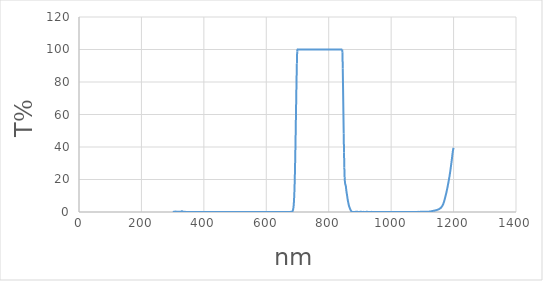
| Category | Series 0 |
|---|---|
| 1200.0 | 39.49 |
| 1199.0 | 38.78 |
| 1198.0 | 37.72 |
| 1197.0 | 36.38 |
| 1196.0 | 34.84 |
| 1195.0 | 33.22 |
| 1194.0 | 31.64 |
| 1193.0 | 30.16 |
| 1192.0 | 28.74 |
| 1191.0 | 27.26 |
| 1190.0 | 25.84 |
| 1189.0 | 24.49 |
| 1188.0 | 23.21 |
| 1187.0 | 22.01 |
| 1186.0 | 20.9 |
| 1185.0 | 19.81 |
| 1184.0 | 18.75 |
| 1183.0 | 17.7 |
| 1182.0 | 16.68 |
| 1181.0 | 15.68 |
| 1180.0 | 14.71 |
| 1179.0 | 13.77 |
| 1178.0 | 12.87 |
| 1177.0 | 12.02 |
| 1176.0 | 11.18 |
| 1175.0 | 10.39 |
| 1174.0 | 9.61 |
| 1173.0 | 8.84 |
| 1172.0 | 8.1 |
| 1171.0 | 7.39 |
| 1170.0 | 6.73 |
| 1169.0 | 6.09 |
| 1168.0 | 5.51 |
| 1167.0 | 4.98 |
| 1166.0 | 4.52 |
| 1165.0 | 4.13 |
| 1164.0 | 3.78 |
| 1163.0 | 3.48 |
| 1162.0 | 3.2 |
| 1161.0 | 2.96 |
| 1160.0 | 2.74 |
| 1159.0 | 2.55 |
| 1158.0 | 2.37 |
| 1157.0 | 2.21 |
| 1156.0 | 2.09 |
| 1155.0 | 1.97 |
| 1154.0 | 1.86 |
| 1153.0 | 1.75 |
| 1152.0 | 1.66 |
| 1151.0 | 1.57 |
| 1150.0 | 1.48 |
| 1149.0 | 1.41 |
| 1148.0 | 1.34 |
| 1147.0 | 1.27 |
| 1146.0 | 1.22 |
| 1145.0 | 1.16 |
| 1144.0 | 1.12 |
| 1143.0 | 1.06 |
| 1142.0 | 1.01 |
| 1141.0 | 0.96 |
| 1140.0 | 0.91 |
| 1139.0 | 0.85 |
| 1138.0 | 0.8 |
| 1137.0 | 0.77 |
| 1136.0 | 0.74 |
| 1135.0 | 0.71 |
| 1134.0 | 0.69 |
| 1133.0 | 0.66 |
| 1132.0 | 0.62 |
| 1131.0 | 0.56 |
| 1130.0 | 0.51 |
| 1129.0 | 0.45 |
| 1128.0 | 0.4 |
| 1127.0 | 0.37 |
| 1126.0 | 0.34 |
| 1125.0 | 0.32 |
| 1124.0 | 0.3 |
| 1123.0 | 0.28 |
| 1122.0 | 0.24 |
| 1121.0 | 0.2 |
| 1120.0 | 0.17 |
| 1119.0 | 0.15 |
| 1118.0 | 0.14 |
| 1117.0 | 0.14 |
| 1116.0 | 0.15 |
| 1115.0 | 0.15 |
| 1114.0 | 0.15 |
| 1113.0 | 0.15 |
| 1112.0 | 0.13 |
| 1111.0 | 0.11 |
| 1110.0 | 0.12 |
| 1109.0 | 0.12 |
| 1108.0 | 0.13 |
| 1107.0 | 0.14 |
| 1106.0 | 0.15 |
| 1105.0 | 0.14 |
| 1104.0 | 0.14 |
| 1103.0 | 0.12 |
| 1102.0 | 0.11 |
| 1101.0 | 0.1 |
| 1100.0 | 0.09 |
| 1099.0 | 0.1 |
| 1098.0 | 0.11 |
| 1097.0 | 0.12 |
| 1096.0 | 0.13 |
| 1095.0 | 0.11 |
| 1094.0 | 0.11 |
| 1093.0 | 0.09 |
| 1092.0 | 0.08 |
| 1091.0 | 0.07 |
| 1090.0 | 0.06 |
| 1089.0 | 0.07 |
| 1088.0 | 0.07 |
| 1087.0 | 0.09 |
| 1086.0 | 0.08 |
| 1085.0 | 0.07 |
| 1084.0 | 0.06 |
| 1083.0 | 0.05 |
| 1082.0 | 0.05 |
| 1081.0 | 0.03 |
| 1080.0 | 0.03 |
| 1079.0 | 0.04 |
| 1078.0 | 0.03 |
| 1077.0 | 0.01 |
| 1076.0 | 0.01 |
| 1075.0 | 0.01 |
| 1074.0 | 0 |
| 1073.0 | 0.01 |
| 1072.0 | 0.01 |
| 1071.0 | 0.01 |
| 1070.0 | 0 |
| 1069.0 | 0 |
| 1068.0 | 0.01 |
| 1067.0 | 0.02 |
| 1066.0 | 0.01 |
| 1065.0 | 0 |
| 1064.0 | 0.02 |
| 1063.0 | 0.02 |
| 1062.0 | 0.01 |
| 1061.0 | 0 |
| 1060.0 | 0.01 |
| 1059.0 | 0 |
| 1058.0 | 0.01 |
| 1057.0 | 0.03 |
| 1056.0 | 0.04 |
| 1055.0 | 0.04 |
| 1054.0 | 0.03 |
| 1053.0 | 0.02 |
| 1052.0 | 0 |
| 1051.0 | 0.01 |
| 1050.0 | 0.02 |
| 1049.0 | 0 |
| 1048.0 | 0.01 |
| 1047.0 | 0.02 |
| 1046.0 | 0.04 |
| 1045.0 | 0.04 |
| 1044.0 | 0.03 |
| 1043.0 | 0.03 |
| 1042.0 | 0.04 |
| 1041.0 | 0.03 |
| 1040.0 | 0.02 |
| 1039.0 | 0.03 |
| 1038.0 | 0.03 |
| 1037.0 | 0.02 |
| 1036.0 | 0.02 |
| 1035.0 | 0.01 |
| 1034.0 | 0.02 |
| 1033.0 | 0.02 |
| 1032.0 | 0.02 |
| 1031.0 | 0.02 |
| 1030.0 | 0.02 |
| 1029.0 | 0.02 |
| 1028.0 | 0.03 |
| 1027.0 | 0.02 |
| 1026.0 | 0.02 |
| 1025.0 | 0.02 |
| 1024.0 | 0.02 |
| 1023.0 | 0.03 |
| 1022.0 | 0.03 |
| 1021.0 | 0.04 |
| 1020.0 | 0.05 |
| 1019.0 | 0.05 |
| 1018.0 | 0.05 |
| 1017.0 | 0.05 |
| 1016.0 | 0.03 |
| 1015.0 | 0.02 |
| 1014.0 | 0.02 |
| 1013.0 | 0.03 |
| 1012.0 | 0.04 |
| 1011.0 | 0.05 |
| 1010.0 | 0.06 |
| 1009.0 | 0.05 |
| 1008.0 | 0.05 |
| 1007.0 | 0.04 |
| 1006.0 | 0.03 |
| 1005.0 | 0.01 |
| 1004.0 | 0 |
| 1003.0 | 0.01 |
| 1002.0 | 0.01 |
| 1001.0 | 0.02 |
| 1000.0 | 0.01 |
| 999.0 | 0.01 |
| 998.0 | 0 |
| 997.0 | 0.01 |
| 996.0 | 0.01 |
| 995.0 | 0.03 |
| 994.0 | 0.03 |
| 993.0 | 0.03 |
| 992.0 | 0.02 |
| 991.0 | 0.01 |
| 990.0 | 0 |
| 989.0 | 0 |
| 988.0 | 0.01 |
| 987.0 | 0 |
| 986.0 | 0.02 |
| 985.0 | 0.03 |
| 984.0 | 0.04 |
| 983.0 | 0.04 |
| 982.0 | 0.02 |
| 981.0 | 0.01 |
| 980.0 | 0.01 |
| 979.0 | 0.01 |
| 978.0 | 0 |
| 977.0 | 0.01 |
| 976.0 | 0.02 |
| 975.0 | 0.04 |
| 974.0 | 0.05 |
| 973.0 | 0.04 |
| 972.0 | 0.04 |
| 971.0 | 0.02 |
| 970.0 | 0.03 |
| 969.0 | 0.04 |
| 968.0 | 0.03 |
| 967.0 | 0.01 |
| 966.0 | 0 |
| 965.0 | 0.01 |
| 964.0 | 0 |
| 963.0 | 0.01 |
| 962.0 | 0.01 |
| 961.0 | 0 |
| 960.0 | 0.03 |
| 959.0 | 0.05 |
| 958.0 | 0.04 |
| 957.0 | 0.01 |
| 956.0 | 0 |
| 955.0 | 0.01 |
| 954.0 | 0.03 |
| 953.0 | 0.01 |
| 952.0 | 0.01 |
| 951.0 | 0.03 |
| 950.0 | 0.04 |
| 949.0 | 0.04 |
| 948.0 | 0.04 |
| 947.0 | 0.03 |
| 946.0 | 0.01 |
| 945.0 | 0.02 |
| 944.0 | 0 |
| 943.0 | 0.01 |
| 942.0 | 0.04 |
| 941.0 | 0.05 |
| 940.0 | 0.04 |
| 939.0 | 0.05 |
| 938.0 | 0.05 |
| 937.0 | 0.07 |
| 936.0 | 0.08 |
| 935.0 | 0.06 |
| 934.0 | 0.07 |
| 933.0 | 0.07 |
| 932.0 | 0.04 |
| 931.0 | 0.04 |
| 930.0 | 0.01 |
| 929.0 | 0 |
| 928.0 | 0 |
| 927.0 | 0.04 |
| 926.0 | 0.06 |
| 925.0 | 0.08 |
| 924.0 | 0.08 |
| 923.0 | 0.11 |
| 922.0 | 0.11 |
| 921.0 | 0.09 |
| 920.0 | 0.08 |
| 919.0 | 0.06 |
| 918.0 | 0.01 |
| 917.0 | 0.01 |
| 916.0 | 0.02 |
| 915.0 | 0.02 |
| 914.0 | 0.02 |
| 913.0 | 0.05 |
| 912.0 | 0.08 |
| 911.0 | 0.08 |
| 910.0 | 0.06 |
| 909.0 | 0.07 |
| 908.0 | 0.06 |
| 907.0 | 0.05 |
| 906.0 | 0.04 |
| 905.0 | 0.08 |
| 904.0 | 0.12 |
| 903.0 | 0.14 |
| 902.0 | 0.14 |
| 901.0 | 0.12 |
| 900.0 | 0.07 |
| 899.0 | 0.03 |
| 898.0 | 0.02 |
| 897.0 | 0.01 |
| 896.0 | 0.05 |
| 895.0 | 0.04 |
| 894.0 | 0.07 |
| 893.0 | 0.09 |
| 892.0 | 0.07 |
| 891.0 | 0.12 |
| 890.0 | 0.14 |
| 889.0 | 0.12 |
| 888.0 | 0.13 |
| 887.0 | 0.11 |
| 886.0 | 0.09 |
| 885.0 | 0.05 |
| 884.0 | 0.01 |
| 883.0 | 0.05 |
| 882.0 | 0.01 |
| 881.0 | 0.02 |
| 880.0 | 0.07 |
| 879.0 | 0.05 |
| 878.0 | 0.03 |
| 877.0 | 0.07 |
| 876.0 | 0.05 |
| 875.0 | 0.02 |
| 874.0 | 0.1 |
| 873.0 | 0.33 |
| 872.0 | 0.6 |
| 871.0 | 0.86 |
| 870.0 | 1.24 |
| 869.0 | 1.67 |
| 868.0 | 2.08 |
| 867.0 | 2.67 |
| 866.0 | 3.16 |
| 865.0 | 3.78 |
| 864.0 | 4.54 |
| 863.0 | 5.47 |
| 862.0 | 6.42 |
| 861.0 | 7.48 |
| 860.0 | 8.66 |
| 859.0 | 9.98 |
| 858.0 | 11.25 |
| 857.0 | 12.43 |
| 856.0 | 13.95 |
| 855.0 | 15.72 |
| 854.0 | 16.57 |
| 853.0 | 17.19 |
| 852.0 | 18.33 |
| 851.0 | 21.46 |
| 850.0 | 27.39 |
| 849.0 | 36.68 |
| 848.0 | 48.37 |
| 847.0 | 61.81 |
| 846.0 | 75.77 |
| 845.0 | 88.36 |
| 844.0 | 98.24 |
| 843.0 | 100 |
| 842.0 | 100 |
| 841.0 | 100 |
| 840.0 | 100 |
| 839.0 | 100 |
| 838.0 | 100 |
| 837.0 | 100 |
| 836.0 | 100 |
| 835.0 | 100 |
| 834.0 | 100 |
| 833.0 | 100 |
| 832.0 | 100 |
| 831.0 | 100 |
| 830.0 | 100 |
| 829.0 | 100 |
| 828.0 | 100 |
| 827.0 | 100 |
| 826.0 | 100 |
| 825.0 | 100 |
| 824.0 | 100 |
| 823.0 | 100 |
| 822.0 | 100 |
| 821.0 | 100 |
| 820.0 | 100 |
| 819.0 | 100 |
| 818.0 | 100 |
| 817.0 | 100 |
| 816.0 | 100 |
| 815.0 | 100 |
| 814.0 | 100 |
| 813.0 | 100 |
| 812.0 | 100 |
| 811.0 | 100 |
| 810.0 | 100 |
| 809.0 | 100 |
| 808.0 | 100 |
| 807.0 | 100 |
| 806.0 | 100 |
| 805.0 | 100 |
| 804.0 | 100 |
| 803.0 | 100 |
| 802.0 | 100 |
| 801.0 | 100 |
| 800.0 | 100 |
| 799.0 | 100 |
| 798.0 | 100 |
| 797.0 | 100 |
| 796.0 | 100 |
| 795.0 | 100 |
| 794.0 | 100 |
| 793.0 | 100 |
| 792.0 | 100 |
| 791.0 | 100 |
| 790.0 | 100 |
| 789.0 | 100 |
| 788.0 | 100 |
| 787.0 | 100 |
| 786.0 | 100 |
| 785.0 | 100 |
| 784.0 | 100 |
| 783.0 | 100 |
| 782.0 | 100 |
| 781.0 | 100 |
| 780.0 | 100 |
| 779.0 | 100 |
| 778.0 | 100 |
| 777.0 | 100 |
| 776.0 | 100 |
| 775.0 | 100 |
| 774.0 | 100 |
| 773.0 | 100 |
| 772.0 | 100 |
| 771.0 | 100 |
| 770.0 | 100 |
| 769.0 | 100 |
| 768.0 | 100 |
| 767.0 | 100 |
| 766.0 | 100 |
| 765.0 | 100 |
| 764.0 | 100 |
| 763.0 | 100 |
| 762.0 | 100 |
| 761.0 | 100 |
| 760.0 | 100 |
| 759.0 | 100 |
| 758.0 | 100 |
| 757.0 | 100 |
| 756.0 | 100 |
| 755.0 | 100 |
| 754.0 | 100 |
| 753.0 | 100 |
| 752.0 | 100 |
| 751.0 | 100 |
| 750.0 | 100 |
| 749.0 | 100 |
| 748.0 | 100 |
| 747.0 | 100 |
| 746.0 | 100 |
| 745.0 | 100 |
| 744.0 | 100 |
| 743.0 | 100 |
| 742.0 | 100 |
| 741.0 | 100 |
| 740.0 | 100 |
| 739.0 | 100 |
| 738.0 | 100 |
| 737.0 | 100 |
| 736.0 | 100 |
| 735.0 | 100 |
| 734.0 | 100 |
| 733.0 | 100 |
| 732.0 | 100 |
| 731.0 | 100 |
| 730.0 | 100 |
| 729.0 | 100 |
| 728.0 | 100 |
| 727.0 | 100 |
| 726.0 | 100 |
| 725.0 | 100 |
| 724.0 | 100 |
| 723.0 | 100 |
| 722.0 | 100 |
| 721.0 | 100 |
| 720.0 | 100 |
| 719.0 | 100 |
| 718.0 | 100 |
| 717.0 | 100 |
| 716.0 | 100 |
| 715.0 | 100 |
| 714.0 | 100 |
| 713.0 | 100 |
| 712.0 | 100 |
| 711.0 | 100 |
| 710.0 | 100 |
| 709.0 | 100 |
| 708.0 | 100 |
| 707.0 | 100 |
| 706.0 | 100 |
| 705.0 | 100 |
| 704.0 | 100 |
| 703.0 | 100 |
| 702.0 | 100 |
| 701.0 | 100 |
| 700.0 | 100 |
| 699.0 | 98.78 |
| 698.0 | 91.36 |
| 697.0 | 81.85 |
| 696.0 | 70.78 |
| 695.0 | 58.97 |
| 694.0 | 47.08 |
| 693.0 | 35.94 |
| 692.0 | 26.21 |
| 691.0 | 18.28 |
| 690.0 | 12.21 |
| 689.0 | 7.77 |
| 688.0 | 4.68 |
| 687.0 | 2.71 |
| 686.0 | 1.58 |
| 685.0 | 0.92 |
| 684.0 | 0.51 |
| 683.0 | 0.28 |
| 682.0 | 0.15 |
| 681.0 | 0.1 |
| 680.0 | 0.09 |
| 679.0 | 0.09 |
| 678.0 | 0.08 |
| 677.0 | 0.06 |
| 676.0 | 0.04 |
| 675.0 | 0.03 |
| 674.0 | 0.02 |
| 673.0 | 0.01 |
| 672.0 | 0.01 |
| 671.0 | 0.01 |
| 670.0 | 0.01 |
| 669.0 | 0.01 |
| 668.0 | 0.01 |
| 667.0 | 0.01 |
| 666.0 | 0.01 |
| 665.0 | 0.02 |
| 664.0 | 0.02 |
| 663.0 | 0.02 |
| 662.0 | 0.02 |
| 661.0 | 0.02 |
| 660.0 | 0.03 |
| 659.0 | 0.03 |
| 658.0 | 0.03 |
| 657.0 | 0.03 |
| 656.0 | 0.03 |
| 655.0 | 0.03 |
| 654.0 | 0.03 |
| 653.0 | 0.02 |
| 652.0 | 0.02 |
| 651.0 | 0.02 |
| 650.0 | 0.02 |
| 649.0 | 0.02 |
| 648.0 | 0.02 |
| 647.0 | 0.01 |
| 646.0 | 0.01 |
| 645.0 | 0.01 |
| 644.0 | 0.01 |
| 643.0 | 0.01 |
| 642.0 | 0.01 |
| 641.0 | 0.02 |
| 640.0 | 0.02 |
| 639.0 | 0.02 |
| 638.0 | 0.02 |
| 637.0 | 0.02 |
| 636.0 | 0.02 |
| 635.0 | 0.02 |
| 634.0 | 0.01 |
| 633.0 | 0.01 |
| 632.0 | 0.01 |
| 631.0 | 0.01 |
| 630.0 | 0.01 |
| 629.0 | 0.01 |
| 628.0 | 0.01 |
| 627.0 | 0.01 |
| 626.0 | 0.02 |
| 625.0 | 0.02 |
| 624.0 | 0.02 |
| 623.0 | 0.02 |
| 622.0 | 0.02 |
| 621.0 | 0.02 |
| 620.0 | 0.02 |
| 619.0 | 0.02 |
| 618.0 | 0.02 |
| 617.0 | 0.02 |
| 616.0 | 0.02 |
| 615.0 | 0.02 |
| 614.0 | 0.02 |
| 613.0 | 0.02 |
| 612.0 | 0.02 |
| 611.0 | 0.02 |
| 610.0 | 0.02 |
| 609.0 | 0.02 |
| 608.0 | 0.02 |
| 607.0 | 0.01 |
| 606.0 | 0.02 |
| 605.0 | 0.02 |
| 604.0 | 0.02 |
| 603.0 | 0.02 |
| 602.0 | 0.02 |
| 601.0 | 0.02 |
| 600.0 | 0.02 |
| 599.0 | 0.02 |
| 598.0 | 0.01 |
| 597.0 | 0.02 |
| 596.0 | 0.01 |
| 595.0 | 0.01 |
| 594.0 | 0.02 |
| 593.0 | 0.01 |
| 592.0 | 0.01 |
| 591.0 | 0.01 |
| 590.0 | 0.01 |
| 589.0 | 0.01 |
| 588.0 | 0.01 |
| 587.0 | 0.01 |
| 586.0 | 0.01 |
| 585.0 | 0.01 |
| 584.0 | 0.01 |
| 583.0 | 0.02 |
| 582.0 | 0.02 |
| 581.0 | 0.02 |
| 580.0 | 0.02 |
| 579.0 | 0.02 |
| 578.0 | 0.02 |
| 577.0 | 0.01 |
| 576.0 | 0.01 |
| 575.0 | 0.01 |
| 574.0 | 0.01 |
| 573.0 | 0.01 |
| 572.0 | 0.01 |
| 571.0 | 0.01 |
| 570.0 | 0.01 |
| 569.0 | 0.02 |
| 568.0 | 0.02 |
| 567.0 | 0.02 |
| 566.0 | 0.02 |
| 565.0 | 0.02 |
| 564.0 | 0.02 |
| 563.0 | 0.02 |
| 562.0 | 0.02 |
| 561.0 | 0.02 |
| 560.0 | 0.02 |
| 559.0 | 0.02 |
| 558.0 | 0.02 |
| 557.0 | 0.01 |
| 556.0 | 0.01 |
| 555.0 | 0.01 |
| 554.0 | 0.01 |
| 553.0 | 0.02 |
| 552.0 | 0.02 |
| 551.0 | 0.02 |
| 550.0 | 0.02 |
| 549.0 | 0.02 |
| 548.0 | 0.02 |
| 547.0 | 0.02 |
| 546.0 | 0.02 |
| 545.0 | 0.02 |
| 544.0 | 0.02 |
| 543.0 | 0.02 |
| 542.0 | 0.02 |
| 541.0 | 0.01 |
| 540.0 | 0.01 |
| 539.0 | 0.01 |
| 538.0 | 0.01 |
| 537.0 | 0.01 |
| 536.0 | 0.01 |
| 535.0 | 0.01 |
| 534.0 | 0.01 |
| 533.0 | 0.01 |
| 532.0 | 0.01 |
| 531.0 | 0.01 |
| 530.0 | 0.01 |
| 529.0 | 0.01 |
| 528.0 | 0.01 |
| 527.0 | 0.01 |
| 526.0 | 0.01 |
| 525.0 | 0.01 |
| 524.0 | 0.01 |
| 523.0 | 0.01 |
| 522.0 | 0.02 |
| 521.0 | 0.02 |
| 520.0 | 0.02 |
| 519.0 | 0.02 |
| 518.0 | 0.01 |
| 517.0 | 0.02 |
| 516.0 | 0.02 |
| 515.0 | 0.02 |
| 514.0 | 0.02 |
| 513.0 | 0.02 |
| 512.0 | 0.02 |
| 511.0 | 0.01 |
| 510.0 | 0.01 |
| 509.0 | 0.01 |
| 508.0 | 0.01 |
| 507.0 | 0.01 |
| 506.0 | 0.01 |
| 505.0 | 0.01 |
| 504.0 | 0.01 |
| 503.0 | 0.01 |
| 502.0 | 0.01 |
| 501.0 | 0.01 |
| 500.0 | 0.01 |
| 499.0 | 0.01 |
| 498.0 | 0.01 |
| 497.0 | 0.01 |
| 496.0 | 0.01 |
| 495.0 | 0.01 |
| 494.0 | 0.01 |
| 493.0 | 0.01 |
| 492.0 | 0.01 |
| 491.0 | 0.01 |
| 490.0 | 0.01 |
| 489.0 | 0.01 |
| 488.0 | 0.01 |
| 487.0 | 0 |
| 486.0 | 0.01 |
| 485.0 | 0.01 |
| 484.0 | 0.01 |
| 483.0 | 0.01 |
| 482.0 | 0.01 |
| 481.0 | 0.01 |
| 480.0 | 0.01 |
| 479.0 | 0.01 |
| 478.0 | 0.01 |
| 477.0 | 0.01 |
| 476.0 | 0.01 |
| 475.0 | 0.01 |
| 474.0 | 0.02 |
| 473.0 | 0.02 |
| 472.0 | 0.02 |
| 471.0 | 0.02 |
| 470.0 | 0.02 |
| 469.0 | 0.02 |
| 468.0 | 0.03 |
| 467.0 | 0.03 |
| 466.0 | 0.03 |
| 465.0 | 0.03 |
| 464.0 | 0.03 |
| 463.0 | 0.03 |
| 462.0 | 0.03 |
| 461.0 | 0.02 |
| 460.0 | 0.02 |
| 459.0 | 0.02 |
| 458.0 | 0.02 |
| 457.0 | 0.01 |
| 456.0 | 0.02 |
| 455.0 | 0.02 |
| 454.0 | 0.02 |
| 453.0 | 0.02 |
| 452.0 | 0.02 |
| 451.0 | 0.02 |
| 450.0 | 0.02 |
| 449.0 | 0.02 |
| 448.0 | 0.02 |
| 447.0 | 0.01 |
| 446.0 | 0.02 |
| 445.0 | 0.01 |
| 444.0 | 0.01 |
| 443.0 | 0.01 |
| 442.0 | 0.02 |
| 441.0 | 0.02 |
| 440.0 | 0.02 |
| 439.0 | 0.02 |
| 438.0 | 0.01 |
| 437.0 | 0.01 |
| 436.0 | 0.01 |
| 435.0 | 0.01 |
| 434.0 | 0.01 |
| 433.0 | 0.01 |
| 432.0 | 0.02 |
| 431.0 | 0.02 |
| 430.0 | 0.02 |
| 429.0 | 0.02 |
| 428.0 | 0.02 |
| 427.0 | 0.02 |
| 426.0 | 0.02 |
| 425.0 | 0.01 |
| 424.0 | 0.01 |
| 423.0 | 0.01 |
| 422.0 | 0.01 |
| 421.0 | 0.01 |
| 420.0 | 0.01 |
| 419.0 | 0.01 |
| 418.0 | 0.01 |
| 417.0 | 0.01 |
| 416.0 | 0.02 |
| 415.0 | 0.01 |
| 414.0 | 0.02 |
| 413.0 | 0.02 |
| 412.0 | 0.02 |
| 411.0 | 0.01 |
| 410.0 | 0.02 |
| 409.0 | 0.02 |
| 408.0 | 0.02 |
| 407.0 | 0.02 |
| 406.0 | 0.03 |
| 405.0 | 0.03 |
| 404.0 | 0.03 |
| 403.0 | 0.03 |
| 402.0 | 0.04 |
| 401.0 | 0.03 |
| 400.0 | 0.04 |
| 399.0 | 0.03 |
| 398.0 | 0.03 |
| 397.0 | 0.03 |
| 396.0 | 0.03 |
| 395.0 | 0.04 |
| 394.0 | 0.03 |
| 393.0 | 0.03 |
| 392.0 | 0.02 |
| 391.0 | 0.02 |
| 390.0 | 0.01 |
| 389.0 | 0.01 |
| 388.0 | 0.01 |
| 387.0 | 0.01 |
| 386.0 | 0.02 |
| 385.0 | 0.01 |
| 384.0 | 0.02 |
| 383.0 | 0.02 |
| 382.0 | 0.01 |
| 381.0 | 0.01 |
| 380.0 | 0.01 |
| 379.0 | 0.01 |
| 378.0 | 0.01 |
| 377.0 | 0.01 |
| 376.0 | 0.01 |
| 375.0 | 0.02 |
| 374.0 | 0.02 |
| 373.0 | 0.02 |
| 372.0 | 0.03 |
| 371.0 | 0.03 |
| 370.0 | 0.03 |
| 369.0 | 0.03 |
| 368.0 | 0.02 |
| 367.0 | 0.02 |
| 366.0 | 0.01 |
| 365.0 | 0.01 |
| 364.0 | 0.01 |
| 363.0 | 0.02 |
| 362.0 | 0.03 |
| 361.0 | 0.04 |
| 360.0 | 0.05 |
| 359.0 | 0.05 |
| 358.0 | 0.05 |
| 357.0 | 0.04 |
| 356.0 | 0.03 |
| 355.0 | 0.02 |
| 354.0 | 0.01 |
| 353.0 | 0.02 |
| 352.0 | 0.03 |
| 351.0 | 0.06 |
| 350.0 | 0.06 |
| 349.0 | 0.06 |
| 348.0 | 0.06 |
| 347.0 | 0.03 |
| 346.0 | 0.04 |
| 345.0 | 0.03 |
| 344.0 | 0.02 |
| 343.0 | 0.04 |
| 342.0 | 0 |
| 341.0 | 0.01 |
| 340.0 | 0.11 |
| 339.0 | 0.18 |
| 338.0 | 0.09 |
| 337.0 | 0.05 |
| 336.0 | 0.03 |
| 335.0 | 0.1 |
| 334.0 | 0.12 |
| 333.0 | 0.22 |
| 332.0 | 0.34 |
| 331.0 | 0.41 |
| 330.0 | 0.51 |
| 329.0 | 0.51 |
| 328.0 | 0.29 |
| 327.0 | 0.08 |
| 326.0 | 0.08 |
| 325.0 | 0.11 |
| 324.0 | 0.07 |
| 323.0 | 0.03 |
| 322.0 | 0.13 |
| 321.0 | 0.01 |
| 320.0 | 0.01 |
| 319.0 | 0.11 |
| 318.0 | 0.15 |
| 317.0 | 0.13 |
| 316.0 | 0.2 |
| 315.0 | 0.2 |
| 314.0 | 0.06 |
| 313.0 | 0.09 |
| 312.0 | 0.17 |
| 311.0 | 0.26 |
| 310.0 | 0.2 |
| 309.0 | 0.19 |
| 308.0 | 0.27 |
| 307.0 | 0.14 |
| 306.0 | 0.13 |
| 305.0 | 0.09 |
| 304.0 | 0.09 |
| 303.0 | 0.09 |
| 302.0 | 0.05 |
| 301.0 | 0.01 |
| 300.0 | 0.05 |